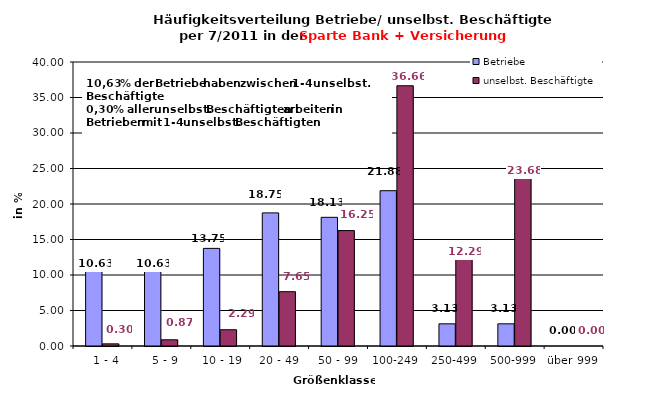
| Category | Betriebe | unselbst. Beschäftigte |
|---|---|---|
|   1 - 4 | 10.625 | 0.303 |
|   5 - 9 | 10.625 | 0.874 |
|  10 - 19 | 13.75 | 2.29 |
| 20 - 49 | 18.75 | 7.651 |
| 50 - 99 | 18.125 | 16.255 |
| 100-249 | 21.875 | 36.657 |
| 250-499 | 3.125 | 12.289 |
| 500-999 | 3.125 | 23.682 |
| über 999 | 0 | 0 |